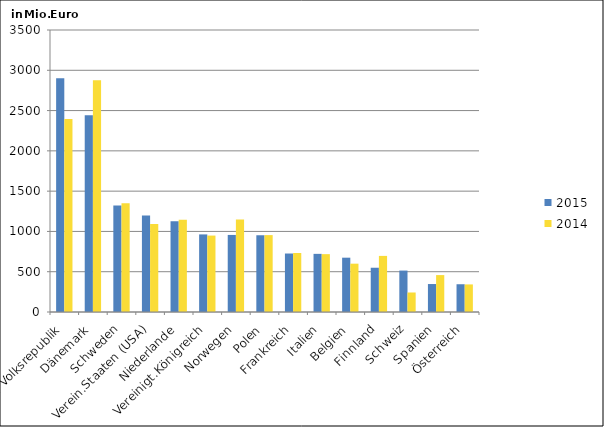
| Category | 2015 | 2014 |
|---|---|---|
| China, Volksrepublik | 2901.411 | 2393.847 |
| Dänemark | 2443.064 | 2875.355 |
| Schweden | 1320.613 | 1350.044 |
| Verein.Staaten (USA) | 1197.773 | 1092.997 |
| Niederlande | 1126.642 | 1146.474 |
| Vereinigt.Königreich | 963.004 | 948.555 |
| Norwegen | 956.461 | 1147.857 |
| Polen | 952.52 | 954.428 |
| Frankreich | 725.884 | 732.447 |
| Italien | 721.579 | 718.034 |
| Belgien | 674.154 | 599.783 |
| Finnland | 549.343 | 696.206 |
| Schweiz | 514.153 | 242.155 |
| Spanien | 347.118 | 458.199 |
| Österreich | 344.553 | 342.296 |